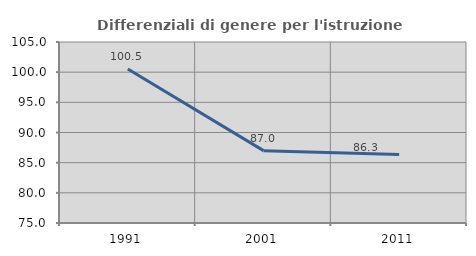
| Category | Differenziali di genere per l'istruzione superiore |
|---|---|
| 1991.0 | 100.525 |
| 2001.0 | 86.996 |
| 2011.0 | 86.342 |